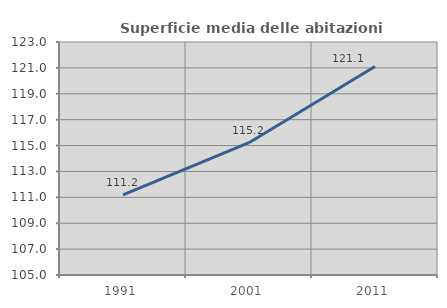
| Category | Superficie media delle abitazioni occupate |
|---|---|
| 1991.0 | 111.183 |
| 2001.0 | 115.223 |
| 2011.0 | 121.106 |